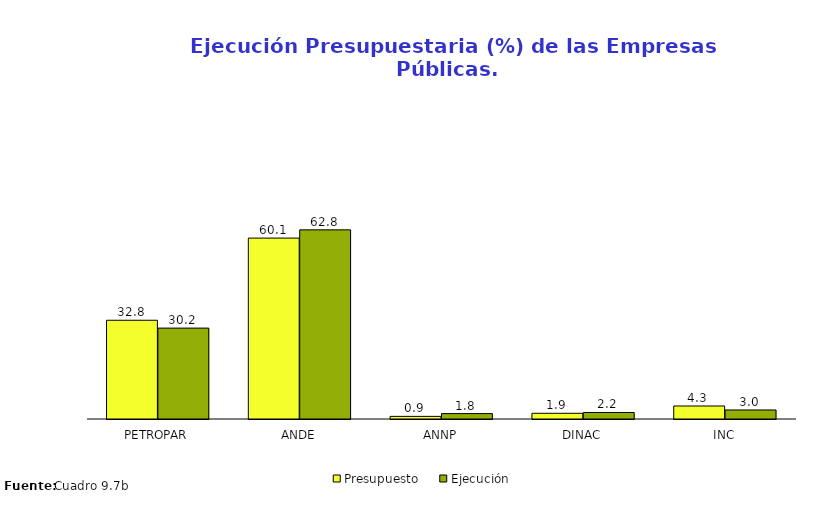
| Category | Presupuesto | Ejecución |
|---|---|---|
| PETROPAR | 32.804 | 30.199 |
| ANDE | 60.107 | 62.839 |
| ANNP | 0.872 | 1.791 |
| DINAC | 1.897 | 2.166 |
| INC | 4.32 | 3.004 |